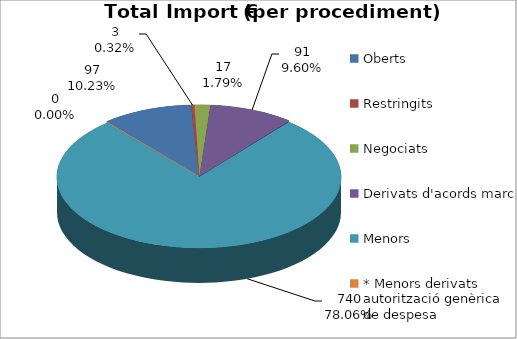
| Category | TOTALS Nombre Total Contractes | TOTALS % total contractes | TOTALS Total Import (€) | TOTALS % total import |
|---|---|---|---|---|
| Oberts | 97 | 0.102 | 118521923 | 0.578 |
| Restringits | 3 | 0.003 | 51825000 | 0.253 |
| Negociats | 17 | 0.018 | 7408260.07 | 0.036 |
| Derivats d'acords marc | 91 | 0.096 | 17041007.89 | 0.083 |
| Menors  | 740 | 0.781 | 8340021.96 | 0.041 |
| * Menors derivats autorització genèrica de despesa | 0 | 0 | 1911666.6 | 0.009 |